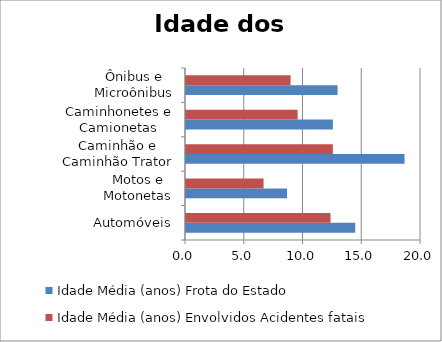
| Category | Idade Média (anos) Frota do Estado | Idade Média (anos) Envolvidos Acidentes fatais  |
|---|---|---|
| Automóveis | 14.4 | 12.3 |
| Motos e Motonetas | 8.6 | 6.6 |
| Caminhão e Caminhão Trator | 18.6 | 12.5 |
| Caminhonetes e Camionetas | 12.5 | 9.5 |
| Ônibus e Microônibus | 12.9 | 8.9 |